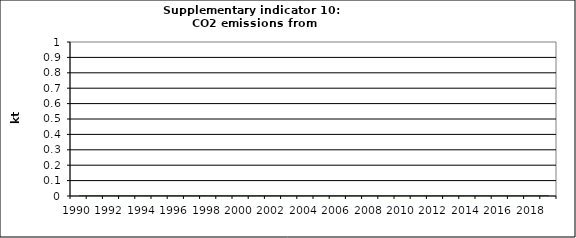
| Category | CO2 emissions from autoproducers, kt |
|---|---|
| 1990 | 0 |
| 1991 | 0 |
| 1992 | 0 |
| 1993 | 0 |
| 1994 | 0 |
| 1995 | 0 |
| 1996 | 0 |
| 1997 | 0 |
| 1998 | 0 |
| 1999 | 0 |
| 2000 | 0 |
| 2001 | 0 |
| 2002 | 0 |
| 2003 | 0 |
| 2004 | 0 |
| 2005 | 0 |
| 2006 | 0 |
| 2007 | 0 |
| 2008 | 0 |
| 2009 | 0 |
| 2010 | 0 |
| 2011 | 0 |
| 2012 | 0 |
| 2013 | 0 |
| 2014 | 0 |
| 2015 | 0 |
| 2016 | 0 |
| 2017 | 0 |
| 2018 | 0 |
| 2019 | 0 |